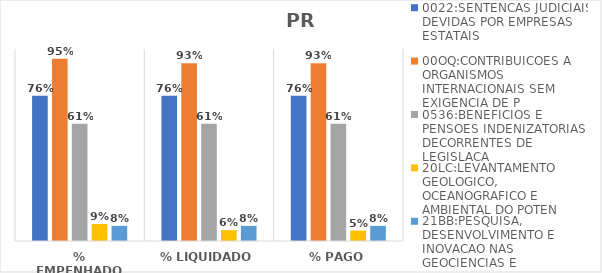
| Category | 0022:SENTENCAS JUDICIAIS DEVIDAS POR EMPRESAS ESTATAIS | 00OQ:CONTRIBUICOES A ORGANISMOS INTERNACIONAIS SEM EXIGENCIA DE P | 0536:BENEFICIOS E PENSOES INDENIZATORIAS DECORRENTES DE LEGISLACA | 20LC:LEVANTAMENTO GEOLOGICO, OCEANOGRAFICO E AMBIENTAL DO POTEN | 21BB:PESQUISA, DESENVOLVIMENTO E INOVACAO NAS GEOCIENCIAS E |
|---|---|---|---|---|---|
| % EMPENHADO | 0.756 | 0.95 | 0.611 | 0.089 | 0.079 |
| % LIQUIDADO | 0.756 | 0.926 | 0.611 | 0.056 | 0.079 |
| % PAGO | 0.756 | 0.926 | 0.611 | 0.055 | 0.079 |